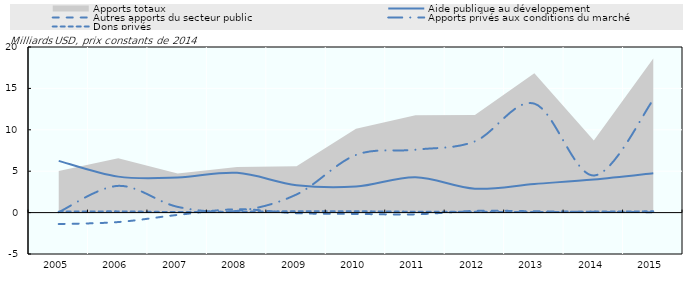
| Category | Aide publique au développement | Autres apports du secteur public | Apports privés aux conditions du marché | Dons privés |
|---|---|---|---|---|
| 2005.0 | 6249.318 | -1381.248 | 54.135 | 115.021 |
| 2006.0 | 4344.898 | -1141.808 | 3227.409 | 147.038 |
| 2007.0 | 4239.693 | -278.42 | 693.268 | 67.28 |
| 2008.0 | 4804.852 | 403.337 | 204.13 | 104.151 |
| 2009.0 | 3311.902 | -72.335 | 2191.024 | 163.12 |
| 2010.0 | 3154.638 | -158.69 | 6961.377 | 158.259 |
| 2011.0 | 4274.362 | -211.091 | 7597.371 | 109.676 |
| 2012.0 | 2885.784 | 206.803 | 8604.711 | 96.28 |
| 2013.0 | 3457.401 | 162.182 | 13158.56 | 58.2 |
| 2014.0 | 4009.18 | 95.96 | 4480.04 | 120.74 |
| 2015.0 | 4766.482 | 51.236 | 13626.848 | 152.233 |